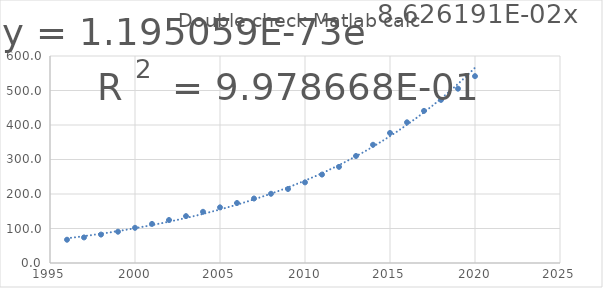
| Category | Series 0 |
|---|---|
| 1996.0 | 67.5 |
| 1997.0 | 74.1 |
| 1998.0 | 82.4 |
| 1999.0 | 90.7 |
| 2000.0 | 102 |
| 2001.0 | 113.3 |
| 2002.0 | 124.6 |
| 2003.0 | 135.9 |
| 2004.0 | 148.4 |
| 2005.0 | 161.3 |
| 2006.0 | 173.9 |
| 2007.0 | 186.9 |
| 2008.0 | 200.7 |
| 2009.0 | 214.5 |
| 2010.0 | 233.7 |
| 2011.0 | 256.3 |
| 2012.0 | 278.6 |
| 2013.0 | 310.2 |
| 2014.0 | 342.7 |
| 2015.0 | 376.9 |
| 2016.0 | 407.8 |
| 2017.0 | 440.913 |
| 2018.0 | 472.774 |
| 2019.0 | 505.251 |
| 2020.0 | 541.562 |